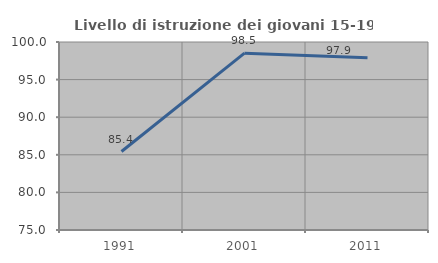
| Category | Livello di istruzione dei giovani 15-19 anni |
|---|---|
| 1991.0 | 85.437 |
| 2001.0 | 98.519 |
| 2011.0 | 97.917 |